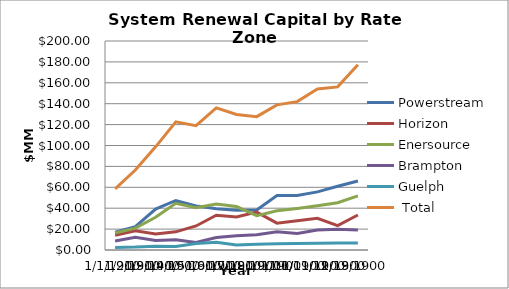
| Category | Powerstream  | Horizon | Enersource | Brampton  | Guelph  |  Total  |
|---|---|---|---|---|---|---|
| 0 | 17 | 14.1 | 16.2 | 8.7 | 2.5 | 58.5 |
| 1 | 22.3 | 18.4 | 20.9 | 12.1 | 2.8 | 76.5 |
| 2 | 39.2 | 15.4 | 31.3 | 9.1 | 3.7 | 98.7 |
| 3 | 47.4 | 17.4 | 44.7 | 9.8 | 3.3 | 122.6 |
| 4 | 42.2 | 23 | 40.4 | 7.2 | 6.2 | 119 |
| 5 | 39.4 | 33.3 | 43.9 | 11.9 | 7.5 | 136 |
| 6 | 38.1 | 31.6 | 41.6 | 13.6 | 4.8 | 129.7 |
| 7 | 38.2 | 36.3 | 32.8 | 14.7 | 5.6 | 127.6 |
| 8 | 52.1 | 25.7 | 37.6 | 17.4 | 6.1 | 138.9 |
| 9 | 52.2 | 27.9 | 39.8 | 15.8 | 6.3 | 142 |
| 10 | 55.6 | 30.4 | 42.4 | 19.1 | 6.5 | 154 |
| 11 | 61 | 23.4 | 45.3 | 19.8 | 6.6 | 156.1 |
| 12 | 66.1 | 33.5 | 51.8 | 19.1 | 6.8 | 177.3 |